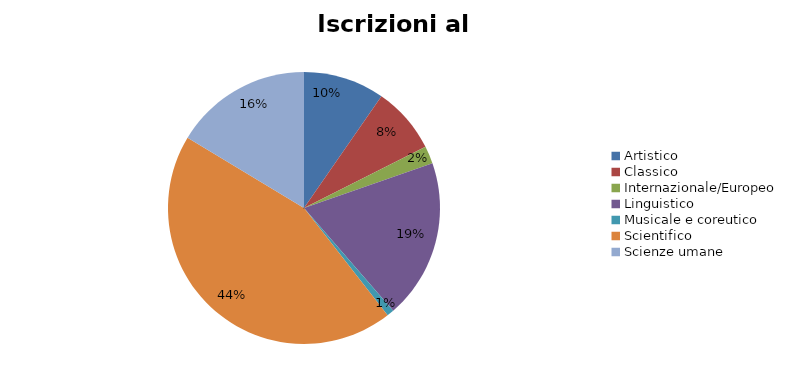
| Category | Series 0 | Series 1 |
|---|---|---|
| Artistico | 1682 |  |
| Classico | 1384 |  |
| Internazionale/Europeo | 365 |  |
| Linguistico | 3306 |  |
| Musicale e coreutico | 148 |  |
| Scientifico | 7707 |  |
| Scienze umane | 2853 |  |